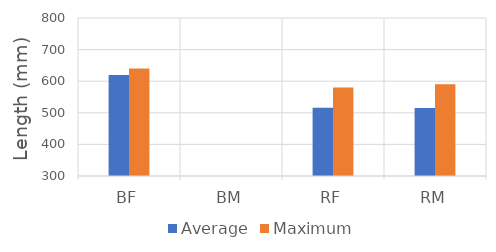
| Category | Average | Maximum |
|---|---|---|
| BF | 620 | 640 |
| BM | 0 | 0 |
| RF | 516.354 | 580 |
| RM | 515.519 | 590 |